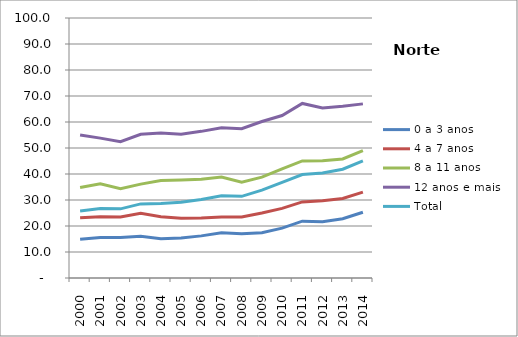
| Category | 0 a 3 anos | 4 a 7 anos | 8 a 11 anos | 12 anos e mais | Total |
|---|---|---|---|---|---|
| 2000.0 | 14.9 | 23.2 | 34.8 | 55 | 25.8 |
| 2001.0 | 15.6 | 23.6 | 36.2 | 53.8 | 26.7 |
| 2002.0 | 15.6 | 23.5 | 34.3 | 52.4 | 26.6 |
| 2003.0 | 16.1 | 24.9 | 36.1 | 55.3 | 28.5 |
| 2004.0 | 15.1 | 23.6 | 37.5 | 55.8 | 28.7 |
| 2005.0 | 15.4 | 23 | 37.7 | 55.3 | 29.1 |
| 2006.0 | 16.2 | 23.1 | 38 | 56.4 | 30.2 |
| 2007.0 | 17.4 | 23.5 | 38.8 | 57.8 | 31.6 |
| 2008.0 | 17 | 23.5 | 36.8 | 57.4 | 31.4 |
| 2009.0 | 17.4 | 25 | 38.8 | 60.2 | 33.8 |
| 2010.0 | 19.167 | 26.784 | 41.987 | 62.491 | 36.787 |
| 2011.0 | 21.848 | 29.254 | 45.031 | 67.132 | 39.773 |
| 2012.0 | 21.676 | 29.713 | 45.137 | 65.388 | 40.347 |
| 2013.0 | 22.793 | 30.564 | 45.799 | 66.037 | 41.828 |
| 2014.0 | 25.288 | 33.048 | 49.014 | 66.972 | 45.048 |